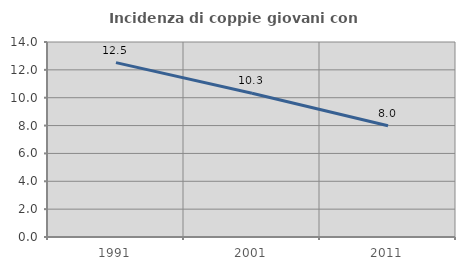
| Category | Incidenza di coppie giovani con figli |
|---|---|
| 1991.0 | 12.518 |
| 2001.0 | 10.318 |
| 2011.0 | 7.982 |